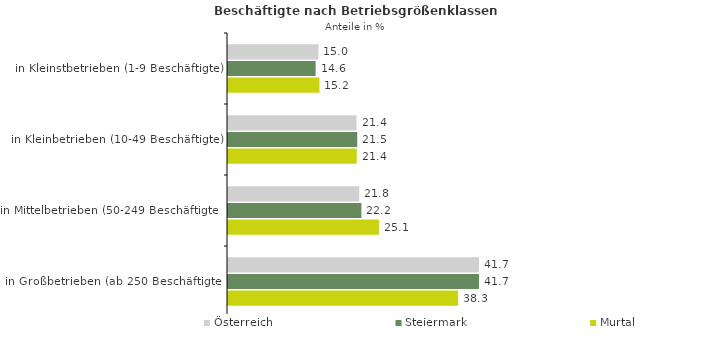
| Category | Österreich | Steiermark | Murtal |
|---|---|---|---|
| in Kleinstbetrieben (1-9 Beschäftigte) | 15.046 | 14.574 | 15.213 |
| in Kleinbetrieben (10-49 Beschäftigte) | 21.375 | 21.498 | 21.407 |
| in Mittelbetrieben (50-249 Beschäftigte) | 21.831 | 22.187 | 25.105 |
| in Großbetrieben (ab 250 Beschäftigte) | 41.748 | 41.742 | 38.275 |